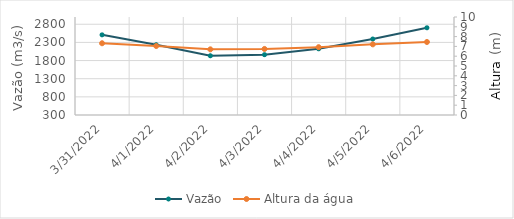
| Category | Vazão |
|---|---|
| 2/23/22 | 1432.57 |
| 2/22/22 | 1585.46 |
| 2/21/22 | 1674.67 |
| 2/20/22 | 1756.03 |
| 2/19/22 | 1761.23 |
| 2/18/22 | 1685.12 |
| 2/17/22 | 1607 |